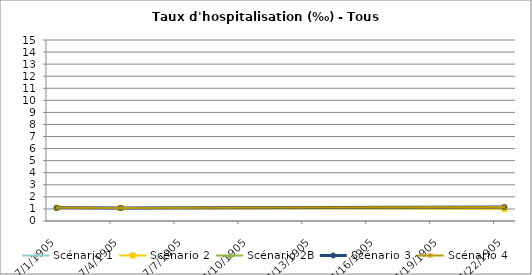
| Category | Scénario 1 | Scénario 2 | Scénario 2B | Scénario 3 | Scénario 4 |
|---|---|---|---|---|---|
| 2009.0 | 1.098 | 1.098 | 1.098 | 1.098 | 1.098 |
| 2012.0 | 1.081 | 1.081 | 1.081 | 1.081 | 1.081 |
| 2030.0 | 1.165 | 1.012 | 1.165 | 1.165 | 1.165 |